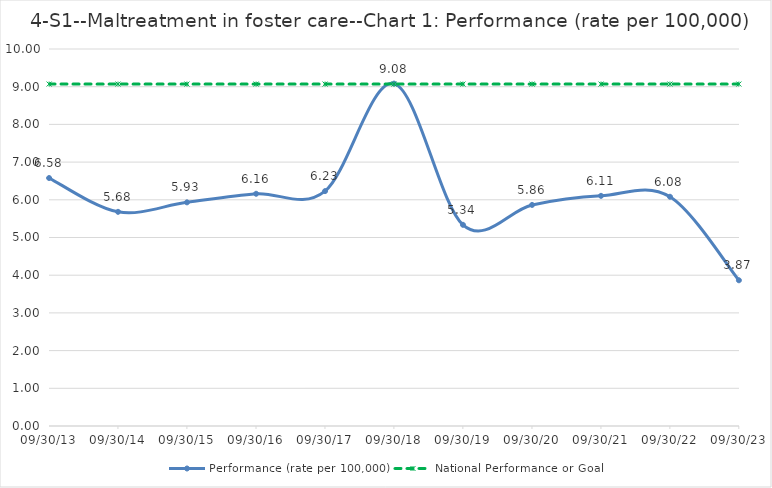
| Category | Performance (rate per 100,000) | National Performance or Goal |
|---|---|---|
| 2013-09-30 | 6.578 | 9.07 |
| 2014-09-30 | 5.681 | 9.07 |
| 2015-09-30 | 5.932 | 9.07 |
| 2016-09-30 | 6.16 | 9.07 |
| 2017-09-30 | 6.23 | 9.07 |
| 2018-09-30 | 9.082 | 9.07 |
| 2019-09-30 | 5.337 | 9.07 |
| 2020-09-30 | 5.864 | 9.07 |
| 2021-09-30 | 6.105 | 9.07 |
| 2022-09-30 | 6.081 | 9.07 |
| 2023-09-30 | 3.865 | 9.07 |